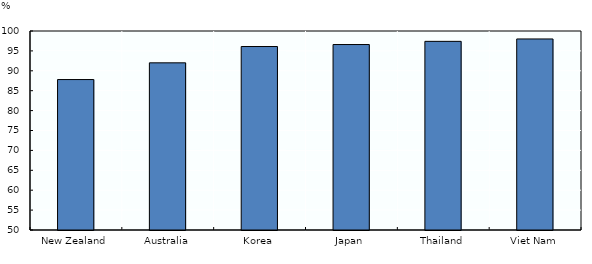
| Category | % of children who were "ever breastfed" |
|---|---|
| New Zealand | 87.8 |
| Australia | 92 |
| Korea | 96.1 |
| Japan | 96.6 |
| Thailand | 97.4 |
| Viet Nam | 98 |